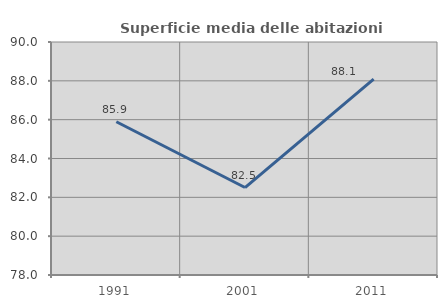
| Category | Superficie media delle abitazioni occupate |
|---|---|
| 1991.0 | 85.892 |
| 2001.0 | 82.505 |
| 2011.0 | 88.088 |